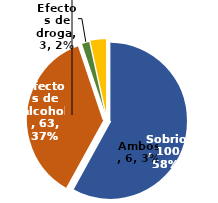
| Category | N° |
|---|---|
| Sobrio | 100 |
| Efectos de alcohol | 63 |
| Efectos de droga | 3 |
| Ambos | 6 |